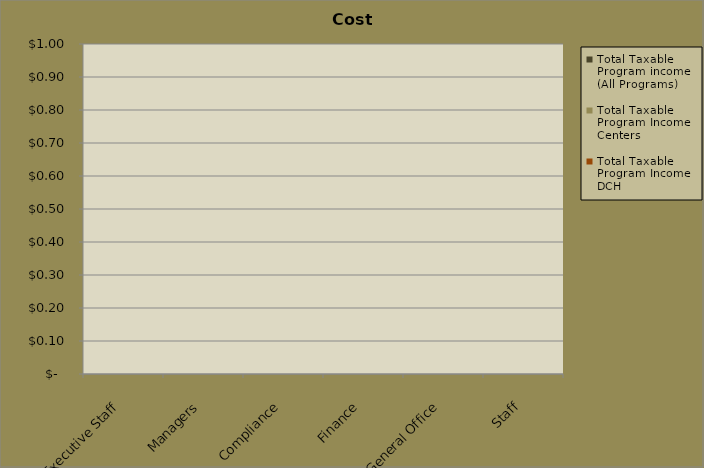
| Category | Total Taxable Program income
(All Programs) | Total Taxable Program Income
Centers | Total Taxable Program Income
DCH |
|---|---|---|---|
| Executive Staff | 0 | 0 | 0 |
| Managers | 0 | 0 | 0 |
| Compliance | 0 | 0 | 0 |
| Finance | 0 | 0 | 0 |
| General Office | 0 | 0 | 0 |
| Staff | 0 | 0 | 0 |